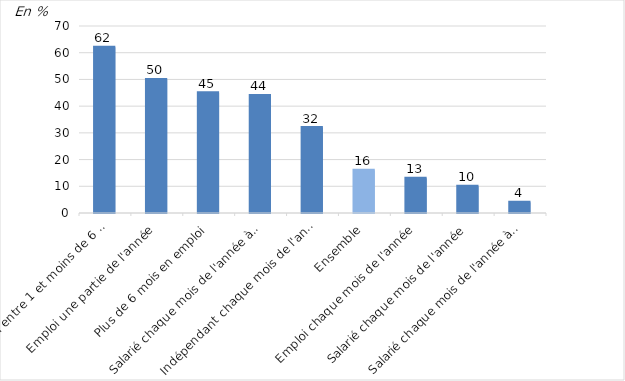
| Category | Series 0 |
|---|---|
| En emploi entre 1 et moins de 6 mois  | 62 |
| Emploi une partie de l'année | 50 |
| Plus de 6 mois en emploi | 45 |
| Salarié chaque mois de l'année à temps partiel | 44 |
| Indépendant chaque mois de l'année | 32 |
| Ensemble | 16 |
| Emploi chaque mois de l'année | 13 |
| Salarié chaque mois de l'année | 10 |
| Salarié chaque mois de l'année à temps complet | 4 |